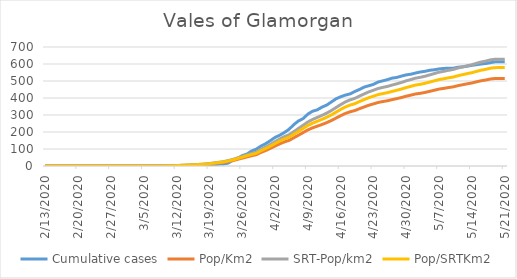
| Category | Cumulative cases | Pop/Km2 | SRT-Pop/km2 | Pop/SRTKm2 |
|---|---|---|---|---|
| 5/21/20 | 613 | 514.962 | 628.201 | 578.768 |
| 5/20/20 | 613 | 514.962 | 628.201 | 578.768 |
| 5/19/20 | 613 | 514.841 | 628.053 | 578.632 |
| 5/18/20 | 608 | 512.019 | 624.61 | 575.46 |
| 5/17/20 | 603 | 506.01 | 617.281 | 568.707 |
| 5/16/20 | 600 | 501.535 | 611.821 | 563.677 |
| 5/15/20 | 596 | 495.244 | 604.147 | 556.607 |
| 5/14/20 | 592 | 488.268 | 595.637 | 548.767 |
| 5/13/20 | 587 | 483.43 | 589.734 | 543.329 |
| 5/12/20 | 583 | 477.865 | 582.946 | 537.075 |
| 5/11/20 | 581 | 472.341 | 576.207 | 530.866 |
| 5/10/20 | 575 | 465.486 | 567.845 | 523.162 |
| 5/9/20 | 575 | 461.494 | 562.975 | 518.675 |
| 5/8/20 | 574 | 456.494 | 556.876 | 513.056 |
| 5/7/20 | 571 | 452.462 | 551.957 | 508.524 |
| 5/6/20 | 566 | 445.809 | 543.841 | 501.046 |
| 5/5/20 | 563 | 439.155 | 535.724 | 493.568 |
| 5/4/20 | 557 | 432.744 | 527.903 | 486.363 |
| 5/3/20 | 553 | 427.583 | 521.607 | 480.562 |
| 5/2/20 | 547 | 423.792 | 516.983 | 476.302 |
| 5/1/20 | 540 | 417.058 | 508.768 | 468.734 |
| 4/30/20 | 536 | 410.687 | 500.996 | 461.573 |
| 4/29/20 | 529 | 402.945 | 491.552 | 452.872 |
| 4/28/20 | 521 | 396.373 | 483.534 | 445.485 |
| 4/27/20 | 517 | 390.486 | 476.352 | 438.869 |
| 4/26/20 | 508 | 383.873 | 468.285 | 431.436 |
| 4/25/20 | 501 | 379.074 | 462.432 | 426.043 |
| 4/24/20 | 494 | 373.631 | 455.791 | 419.925 |
| 4/23/20 | 480 | 365.284 | 445.609 | 410.544 |
| 4/22/20 | 472 | 357.3 | 435.869 | 401.571 |
| 4/21/20 | 464 | 347.179 | 423.523 | 390.196 |
| 4/20/20 | 450 | 336.977 | 411.078 | 378.73 |
| 4/19/20 | 438 | 325.889 | 397.551 | 366.268 |
| 4/18/20 | 424 | 318.711 | 388.795 | 358.201 |
| 4/17/20 | 417 | 308.913 | 376.842 | 347.188 |
| 4/16/20 | 407 | 295.929 | 361.003 | 332.596 |
| 4/15/20 | 395 | 281.453 | 343.344 | 316.326 |
| 4/14/20 | 376 | 267.138 | 325.881 | 300.238 |
| 4/13/20 | 358 | 254.638 | 310.633 | 286.189 |
| 4/12/20 | 346 | 243.872 | 297.499 | 274.089 |
| 4/11/20 | 330 | 234.074 | 285.546 | 263.076 |
| 4/10/20 | 322 | 224.235 | 273.544 | 252.019 |
| 4/9/20 | 305 | 212.138 | 258.787 | 238.423 |
| 4/8/20 | 279 | 196.412 | 239.603 | 220.749 |
| 4/7/20 | 265 | 180.969 | 220.763 | 203.391 |
| 4/6/20 | 243 | 165.807 | 202.268 | 186.351 |
| 4/5/20 | 216 | 150.525 | 183.625 | 169.176 |
| 4/4/20 | 197 | 141.614 | 172.754 | 159.16 |
| 4/3/20 | 181 | 130.283 | 158.932 | 146.425 |
| 4/2/20 | 168 | 117.218 | 142.994 | 131.742 |
| 4/1/20 | 149 | 103.791 | 126.614 | 116.651 |
| 3/31/20 | 131 | 90.888 | 110.873 | 102.149 |
| 3/30/20 | 117 | 79.96 | 97.543 | 89.867 |
| 3/29/20 | 99 | 66.492 | 81.114 | 74.731 |
| 3/28/20 | 88 | 60.202 | 73.44 | 67.661 |
| 3/27/20 | 70 | 53.508 | 65.275 | 60.138 |
| 3/26/20 | 61 | 46.049 | 56.175 | 51.754 |
| 3/25/20 | 44 | 39.032 | 47.616 | 43.869 |
| 3/24/20 | 34 | 31.653 | 38.614 | 35.575 |
| 3/23/20 | 17 | 26.21 | 31.973 | 29.457 |
| 3/22/20 | 12 | 20.968 | 25.579 | 23.566 |
| 3/21/20 | 11 | 17.903 | 21.84 | 20.122 |
| 3/20/20 | 6 | 14.879 | 18.151 | 16.723 |
| 3/19/20 | 5 | 11.976 | 14.609 | 13.46 |
| 3/18/20 | 3 | 9.556 | 11.658 | 10.741 |
| 3/17/20 | 1 | 8.145 | 9.936 | 9.154 |
| 3/16/20 | 1 | 6.653 | 8.116 | 7.478 |
| 3/15/20 | 1 | 5.282 | 6.444 | 5.937 |
| 3/14/20 | 1 | 4.113 | 5.017 | 4.623 |
| 3/13/20 | 0 | 3.347 | 4.083 | 3.761 |
| 3/12/20 | 0 | 2.258 | 2.755 | 2.538 |
| 3/11/20 | 0 | 1.29 | 1.574 | 1.45 |
| 3/10/20 | 0 | 0.726 | 0.885 | 0.816 |
| 3/9/20 | 0 | 0.282 | 0.344 | 0.317 |
| 3/8/20 | 0 | 0.161 | 0.197 | 0.181 |
| 3/7/20 | 0 | 0.161 | 0.197 | 0.181 |
| 3/6/20 | 0 | 0.081 | 0.098 | 0.091 |
| 3/5/20 | 0 | 0.081 | 0.098 | 0.091 |
| 3/4/20 | 0 | 0.081 | 0.098 | 0.091 |
| 3/3/20 | 0 | 0.04 | 0.049 | 0.045 |
| 3/2/20 | 0 | 0.04 | 0.049 | 0.045 |
| 3/1/20 | 0 | 0.04 | 0.049 | 0.045 |
| 2/29/20 | 0 | 0.04 | 0.049 | 0.045 |
| 2/28/20 | 0 | 0.04 | 0.049 | 0.045 |
| 2/27/20 | 0 | 0.04 | 0.049 | 0.045 |
| 2/26/20 | 0 | 0 | 0 | 0 |
| 2/25/20 | 0 | 0 | 0 | 0 |
| 2/24/20 | 0 | 0 | 0 | 0 |
| 2/23/20 | 0 | 0 | 0 | 0 |
| 2/22/20 | 0 | 0 | 0 | 0 |
| 2/21/20 | 0 | 0 | 0 | 0 |
| 2/20/20 | 0 | 0 | 0 | 0 |
| 2/19/20 | 0 | 0 | 0 | 0 |
| 2/18/20 | 0 | 0 | 0 | 0 |
| 2/17/20 | 0 | 0 | 0 | 0 |
| 2/16/20 | 0 | 0 | 0 | 0 |
| 2/15/20 | 0 | 0 | 0 | 0 |
| 2/14/20 | 0 | 0 | 0 | 0 |
| 2/13/20 | 0 | 0 | 0 | 0 |